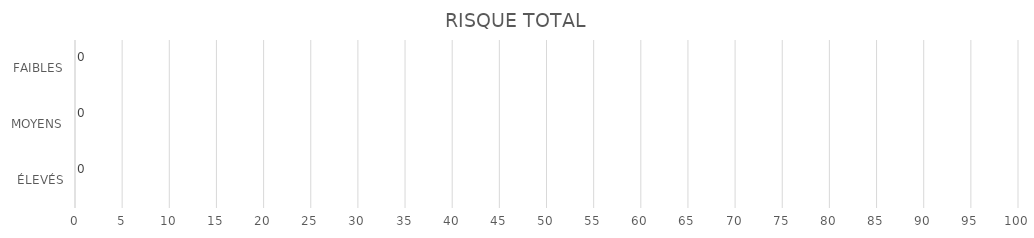
| Category | Series 1 | Series 0 |
|---|---|---|
| ÉLEVÉS | 0 | 0 |
| MOYENS | 0 | 0 |
| FAIBLES | 0 | 0 |